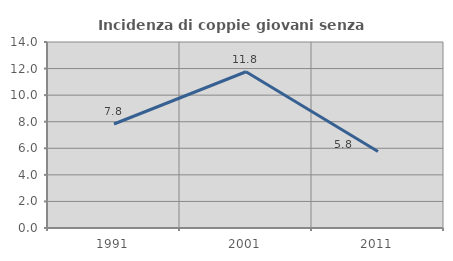
| Category | Incidenza di coppie giovani senza figli |
|---|---|
| 1991.0 | 7.829 |
| 2001.0 | 11.76 |
| 2011.0 | 5.764 |